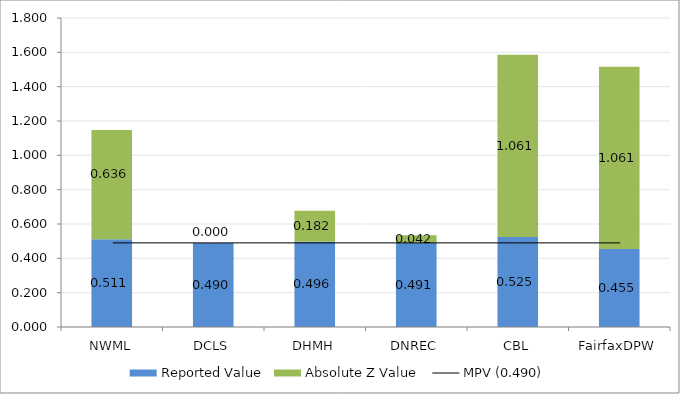
| Category | Reported Value | Absolute Z Value  |
|---|---|---|
| NWML | 0.511 | 0.636 |
| DCLS | 0.49 | 0 |
| DHMH | 0.496 | 0.182 |
| DNREC | 0.491 | 0.042 |
| CBL | 0.525 | 1.061 |
| FairfaxDPW | 0.455 | 1.061 |